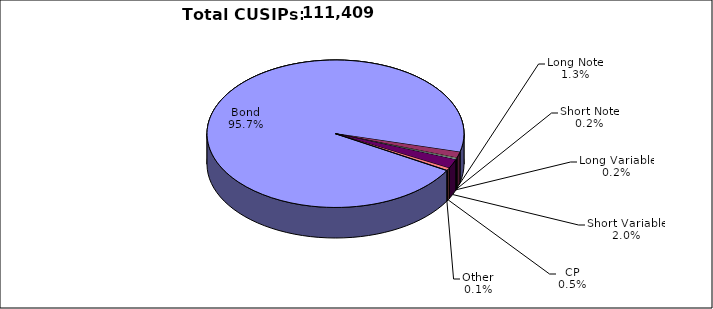
| Category | CUSIPs |
|---|---|
| Bond | 106599 |
| Long Note | 1477 |
| Short Note | 200 |
| Long Variable | 221 |
| Short Variable | 2254 |
| CP | 592 |
| Other | 66 |